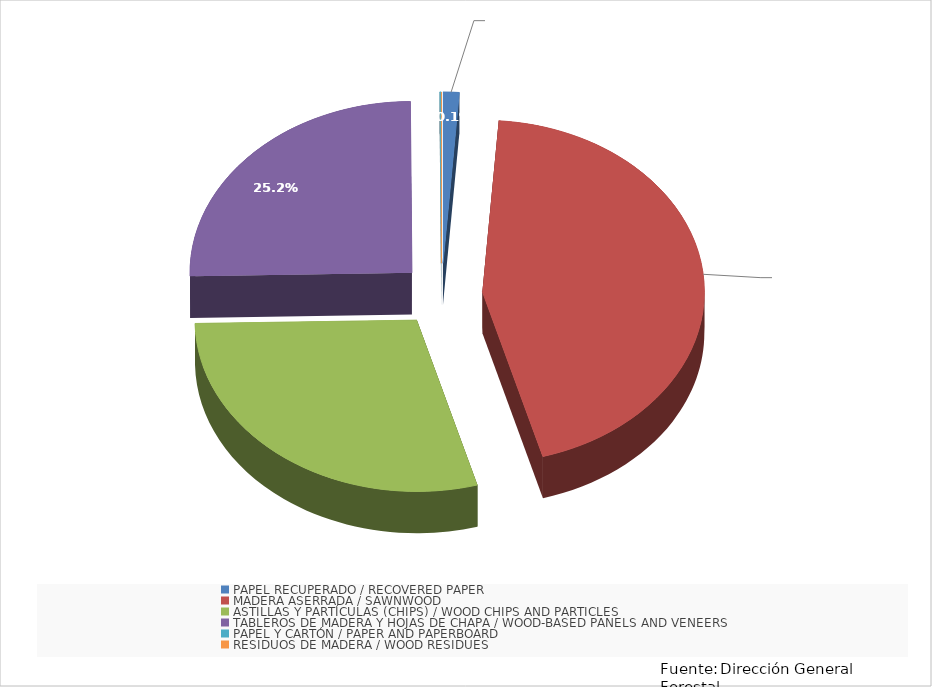
| Category | Series 0 |
|---|---|
| PAPEL RECUPERADO / RECOVERED PAPER | 4839.057 |
| MADERA ASERRADA / SAWNWOOD | 183572.585 |
| ASTILLAS Y PARTÍCULAS (CHIPS) / WOOD CHIPS AND PARTICLES | 120169.682 |
| TABLEROS DE MADERA Y HOJAS DE CHAPA / WOOD-BASED PANELS AND VENEERS | 104103.177 |
| PAPEL Y CARTÓN / PAPER AND PAPERBOARD | 467.297 |
| RESIDUOS DE MADERA / WOOD RESIDUES | 0 |